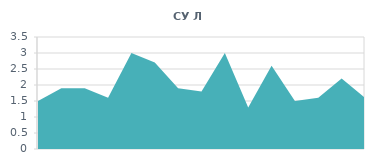
| Category | СУ Л |
|---|---|
| 0 | 1.5 |
| 1 | 1.9 |
| 2 | 1.9 |
| 3 | 1.6 |
| 4 | 3 |
| 5 | 2.7 |
| 6 | 1.9 |
| 7 | 1.8 |
| 8 | 3 |
| 9 | 1.3 |
| 10 | 2.6 |
| 11 | 1.5 |
| 12 | 1.6 |
| 13 | 2.2 |
| 14 | 1.6 |